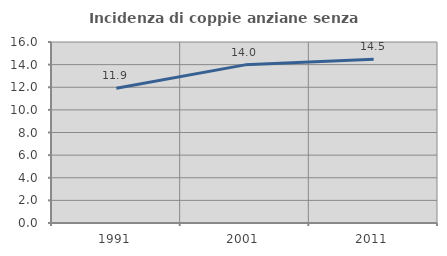
| Category | Incidenza di coppie anziane senza figli  |
|---|---|
| 1991.0 | 11.909 |
| 2001.0 | 13.98 |
| 2011.0 | 14.467 |